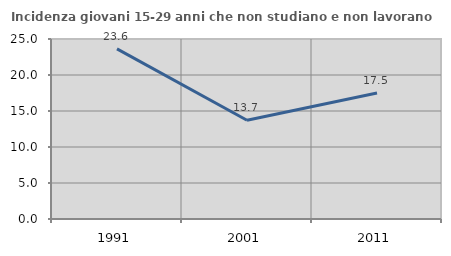
| Category | Incidenza giovani 15-29 anni che non studiano e non lavorano  |
|---|---|
| 1991.0 | 23.632 |
| 2001.0 | 13.718 |
| 2011.0 | 17.495 |